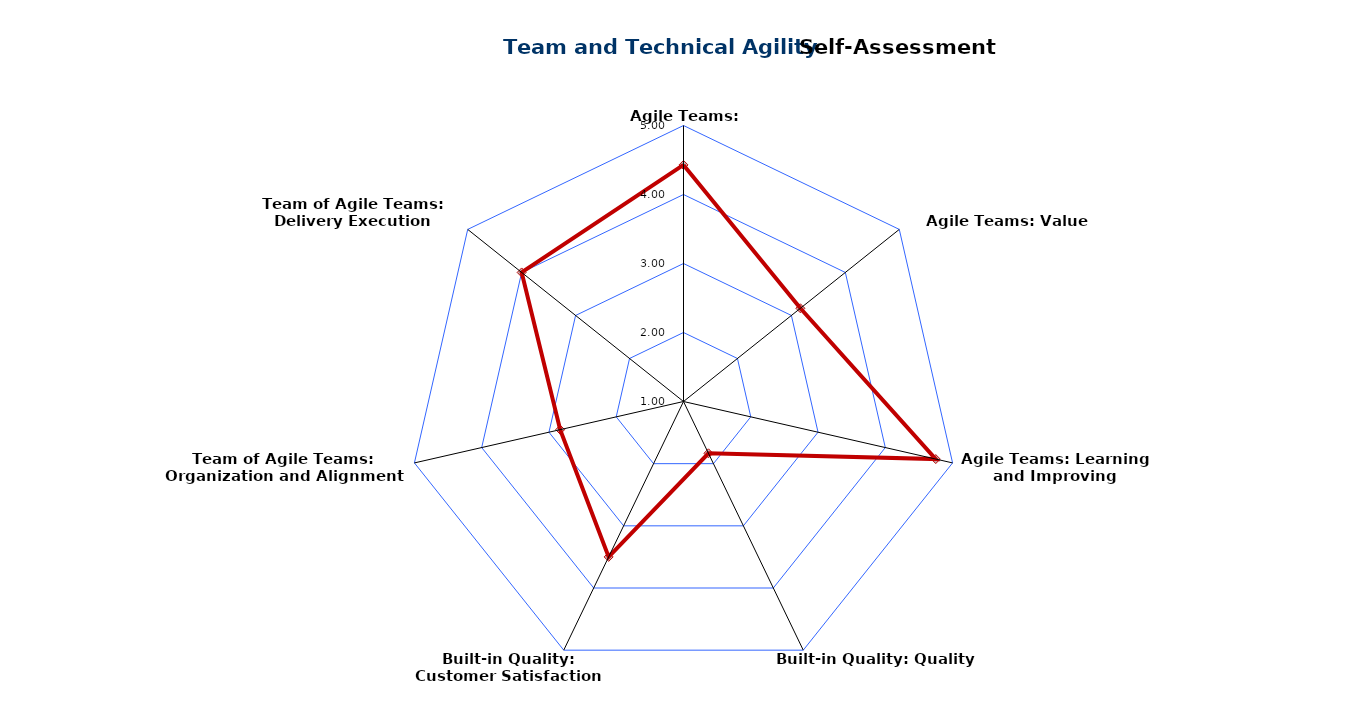
| Category | Series 0 |
|---|---|
| Agile Teams: Teamwork | 4.429 |
| Agile Teams: Value Delivery | 3.167 |
| Agile Teams: Learning and Improving | 4.75 |
| Built-in Quality: Quality Practices | 1.833 |
| Built-in Quality: Customer Satisfaction | 3.5 |
| Team of Agile Teams: Organization and Alignment | 2.833 |
| Team of Agile Teams: Delivery Execution | 4 |